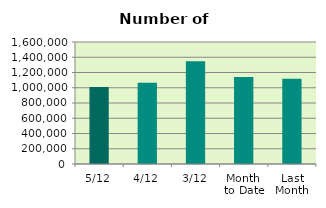
| Category | Series 0 |
|---|---|
| 5/12 | 1011092 |
| 4/12 | 1065582 |
| 3/12 | 1347996 |
| Month 
to Date | 1141556.667 |
| Last
Month | 1117514.364 |